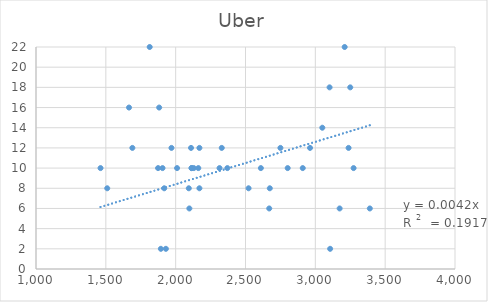
| Category | Uber |
|---|---|
| 1894.0 | 2 |
| 2802.0 | 10 |
| 2750.0 | 12 |
| 2110.0 | 12 |
| 1970.0 | 12 |
| 2098.0 | 6 |
| 1930.0 | 2 |
| 2130.0 | 10 |
| 2330.0 | 12 |
| 2010.0 | 10 |
| 2674.0 | 8 |
| 2370.0 | 10 |
| 1906.0 | 10 |
| 2114.0 | 10 |
| 2910.0 | 10 |
| 1510.0 | 8 |
| 1874.0 | 10 |
| 2094.0 | 8 |
| 2670.0 | 6 |
| 3390.0 | 6 |
| 1882.0 | 16 |
| 3050.0 | 14 |
| 3174.0 | 6 |
| 2114.0 | 10 |
| 1690.0 | 12 |
| 1918.0 | 8 |
| 3238.0 | 12 |
| 1814.0 | 22 |
| 2610.0 | 10 |
| 1462.0 | 10 |
| 3106.0 | 2 |
| 2522.0 | 8 |
| 1666.0 | 16 |
| 3274.0 | 10 |
| 3102.0 | 18 |
| 3210.0 | 22 |
| 2170.0 | 12 |
| 2962.0 | 12 |
| 2170.0 | 8 |
| 3250.0 | 18 |
| 2314.0 | 10 |
| 2162.0 | 10 |